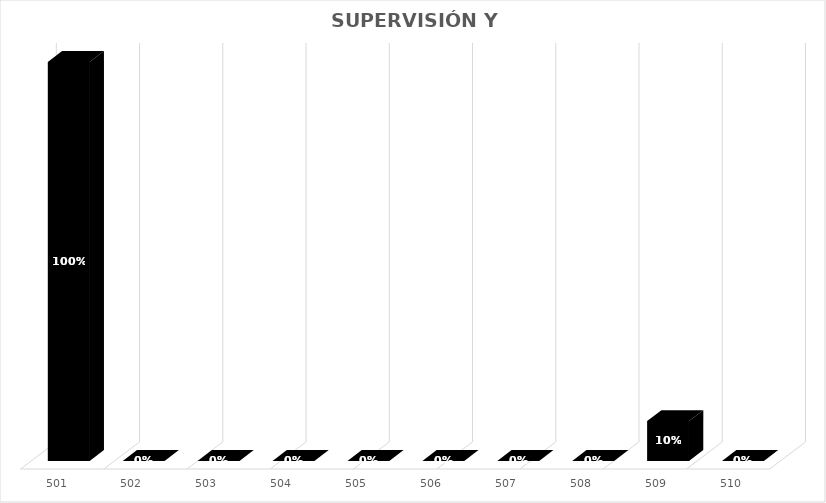
| Category | % Avance |
|---|---|
| 501.0 | 1 |
| 502.0 | 0 |
| 503.0 | 0 |
| 504.0 | 0 |
| 505.0 | 0 |
| 506.0 | 0 |
| 507.0 | 0 |
| 508.0 | 0 |
| 509.0 | 0.1 |
| 510.0 | 0 |